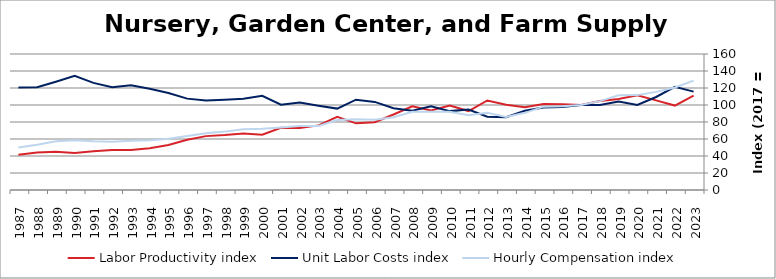
| Category | Labor Productivity index | Unit Labor Costs index | Hourly Compensation index |
|---|---|---|---|
| 2023.0 | 111.146 | 115.744 | 128.644 |
| 2022.0 | 99.328 | 121.416 | 120.601 |
| 2021.0 | 105.478 | 109.438 | 115.433 |
| 2020.0 | 111.508 | 100.103 | 111.623 |
| 2019.0 | 107.031 | 104.115 | 111.435 |
| 2018.0 | 104.576 | 100.007 | 104.583 |
| 2017.0 | 100 | 100 | 100 |
| 2016.0 | 100.993 | 97.646 | 98.616 |
| 2015.0 | 101.094 | 96.993 | 98.054 |
| 2014.0 | 97.437 | 93.181 | 90.793 |
| 2013.0 | 100.371 | 85.7 | 86.018 |
| 2012.0 | 105.362 | 86.212 | 90.835 |
| 2011.0 | 92.861 | 94.582 | 87.829 |
| 2010.0 | 99.325 | 92.802 | 92.176 |
| 2009.0 | 93.643 | 98.463 | 92.204 |
| 2008.0 | 98.503 | 93.382 | 91.984 |
| 2007.0 | 88.817 | 96.296 | 85.527 |
| 2006.0 | 79.822 | 103.655 | 82.74 |
| 2005.0 | 78.397 | 106.276 | 83.317 |
| 2004.0 | 86.055 | 95.764 | 82.41 |
| 2003.0 | 76.016 | 99.211 | 75.416 |
| 2002.0 | 73.075 | 102.895 | 75.19 |
| 2001.0 | 73.271 | 100.38 | 73.549 |
| 2000.0 | 64.986 | 110.761 | 71.979 |
| 1999.0 | 66.587 | 107.278 | 71.434 |
| 1998.0 | 64.63 | 106.268 | 68.681 |
| 1997.0 | 63.387 | 105.347 | 66.777 |
| 1996.0 | 59.078 | 107.488 | 63.502 |
| 1995.0 | 52.853 | 114.194 | 60.354 |
| 1994.0 | 49.073 | 119.135 | 58.463 |
| 1993.0 | 47.021 | 123.358 | 58.005 |
| 1992.0 | 47.001 | 120.799 | 56.777 |
| 1991.0 | 45.552 | 126.04 | 57.413 |
| 1990.0 | 43.62 | 134.252 | 58.561 |
| 1989.0 | 44.899 | 127.433 | 57.216 |
| 1988.0 | 44.02 | 120.907 | 53.223 |
| 1987.0 | 41.487 | 120.659 | 50.058 |